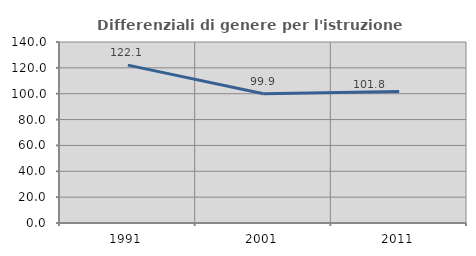
| Category | Differenziali di genere per l'istruzione superiore |
|---|---|
| 1991.0 | 122.105 |
| 2001.0 | 99.907 |
| 2011.0 | 101.761 |